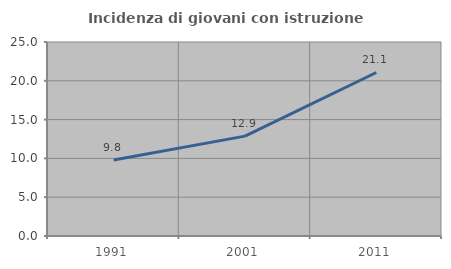
| Category | Incidenza di giovani con istruzione universitaria |
|---|---|
| 1991.0 | 9.793 |
| 2001.0 | 12.871 |
| 2011.0 | 21.07 |